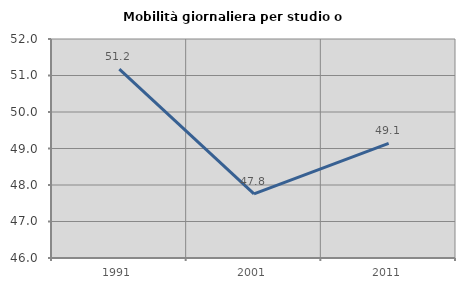
| Category | Mobilità giornaliera per studio o lavoro |
|---|---|
| 1991.0 | 51.173 |
| 2001.0 | 47.757 |
| 2011.0 | 49.143 |